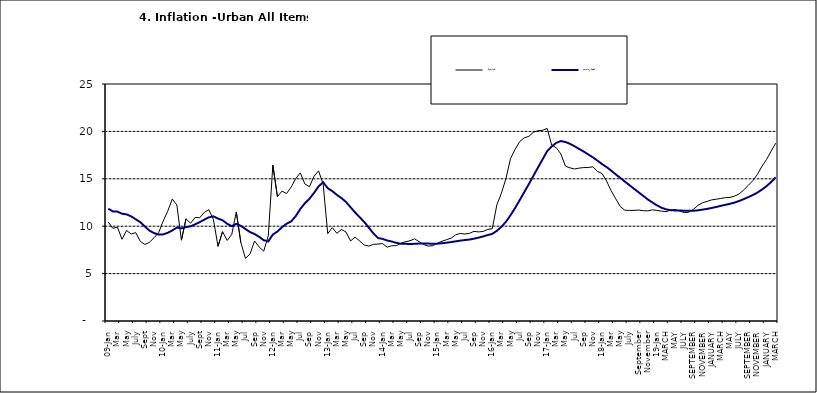
| Category | Year-on Rate | 12-Month Average |
|---|---|---|
| 09-Jan | 10.439 | 11.844 |
| Feb | 9.772 | 11.562 |
| Mar | 9.907 | 11.538 |
| Apr | 8.618 | 11.319 |
| May | 9.547 | 11.246 |
| June | 9.17 | 11.039 |
| July | 9.325 | 10.738 |
| Aug | 8.401 | 10.424 |
| Sept | 8.07 | 9.973 |
| Oct | 8.3 | 9.535 |
| Nov | 8.781 | 9.278 |
| Dec | 9.298 | 9.117 |
| 10-Jan | 10.534 | 9.136 |
| Feb | 11.584 | 9.297 |
| Mar | 12.864 | 9.555 |
| Apr | 12.24 | 9.859 |
| May | 8.524 | 9.769 |
| June | 10.781 | 9.904 |
| July | 10.313 | 9.987 |
| Aug | 10.924 | 10.197 |
| Sept | 10.891 | 10.43 |
| Oct | 11.457 | 10.689 |
| Nov | 11.748 | 10.932 |
| Dec | 10.699 | 11.042 |
| 11-Jan | 7.878 | 10.806 |
| Feb | 9.426 | 10.623 |
| Mar | 8.498 | 10.26 |
| Apr | 9.11 | 10.005 |
| May | 11.5 | 10.249 |
| Jun | 8.278 | 10.034 |
| Jul | 6.608 | 9.711 |
| Aug | 7.061 | 9.38 |
| Sep | 8.443 | 9.178 |
| Oct | 7.802 | 8.88 |
| Nov | 7.365 | 8.525 |
| Dec | 8.993 | 8.395 |
| 12-Jan | 16.445 | 9.119 |
| Feb | 13.123 | 9.443 |
| Mar | 13.701 | 9.889 |
| Apr | 13.447 | 10.259 |
| May | 14.127 | 10.496 |
| Jun | 15.012 | 11.062 |
| Jul | 15.63 | 11.81 |
| Aug | 14.456 | 12.422 |
| Sep | 14.162 | 12.893 |
| Oct | 15.26 | 13.506 |
| Nov | 15.836 | 14.199 |
| Dec | 14.459 | 14.637 |
| 13-Jan | 9.22 | 14.006 |
| Feb | 9.85 | 13.703 |
| Mar | 9.253 | 13.302 |
| Apr | 9.657 | 12.966 |
| May | 9.385 | 12.557 |
| Jun | 8.441 | 11.999 |
| Jul | 8.849 | 11.443 |
| Aug | 8.431 | 10.946 |
| Sep | 8.013 | 10.44 |
| Oct | 7.9 | 9.849 |
| Nov | 8.086 | 9.245 |
| Dec | 8.117 | 8.75 |
| 14-Jan | 8.164 | 8.662 |
| Feb | 7.791 | 8.493 |
| Mar | 7.937 | 8.384 |
| Apr | 7.947 | 8.246 |
| May | 8.195 | 8.151 |
| Jun | 8.358 | 8.146 |
| Jul | 8.464 | 8.118 |
| Aug | 8.673 | 8.141 |
| Sep | 8.357 | 8.17 |
| Oct | 8.064 | 8.182 |
| Nov | 7.902 | 8.165 |
| Dec | 7.948 | 8.151 |
| 15-Jan | 8.211 | 8.155 |
| Feb | 8.412 | 8.206 |
| Mar | 8.579 | 8.26 |
| Apr | 8.742 | 8.326 |
| May | 9.092 | 8.403 |
| Jun | 9.232 | 8.478 |
| Jul | 9.177 | 8.54 |
| Aug | 9.25 | 8.591 |
| Sep | 9.455 | 8.684 |
| Oct | 9.398 | 8.795 |
| Nov | 9.442 | 8.922 |
| Dec | 9.665 | 9.064 |
| 16-Jan | 9.728 | 9.19 |
| Feb | 12.254 | 9.516 |
| Mar | 13.485 | 9.935 |
| Apr | 15.052 | 10.474 |
| May | 17.148 | 11.165 |
| Jun | 18.111 | 11.925 |
| Jul | 18.927 | 12.754 |
| Aug | 19.325 | 13.605 |
| Sep | 19.476 | 14.444 |
| Oct | 19.914 | 15.318 |
| Nov | 20.067 | 16.193 |
| Dec | 20.118 | 17.05 |
| 17-Jan | 20.315 | 17.914 |
| Feb | 18.569 | 18.418 |
| Mar | 18.27 | 18.794 |
| Apr | 17.621 | 18.982 |
| May | 16.343 | 18.883 |
| Jun | 16.153 | 18.692 |
| Jul | 16.038 | 18.43 |
| Aug | 16.128 | 18.151 |
| Sep | 16.183 | 17.872 |
| Oct | 16.187 | 17.567 |
| Nov | 16.267 | 17.264 |
| Dec | 15.785 | 16.921 |
| 18-Jan | 15.559 | 16.55 |
| Feb | 14.763 | 16.241 |
| Mar | 13.748 | 15.866 |
| Apr | 12.893 | 15.468 |
| May | 12.077 | 15.096 |
| June | 11.683 | 14.706 |
| July | 11.661 | 14.329 |
| August | 11.673 | 13.951 |
| September | 11.697 | 13.578 |
| October | 11.64 | 13.206 |
| November | 11.615 | 12.831 |
| December | 11.731 | 12.509 |
| 19-Jan | 11.664 | 12.203 |
| February | 11.592 | 11.954 |
| MARCH | 11.535 | 11.78 |
| APRIL | 11.696 | 11.686 |
| MAY | 11.756 | 11.662 |
| JUNE | 11.605 | 11.655 |
| JULY | 11.432 | 11.635 |
| AUGUST | 11.479 | 11.618 |
| SEPTEMBER | 11.776 | 11.626 |
| OCTOBER | 12.202 | 11.676 |
| NOVEMBER | 12.469 | 11.75 |
| DECEMBER | 12.617 | 11.827 |
| JANUARY | 12.779 | 11.923 |
| FEBRUARY | 12.847 | 12.03 |
| MARCH | 12.932 | 12.147 |
| APRIL | 13.008 | 12.258 |
| MAY | 13.033 | 12.365 |
| JUNE | 13.178 | 12.496 |
| JULY | 13.403 | 12.659 |
| AUGUST | 13.827 | 12.855 |
| SEPTEMBER | 14.306 | 13.068 |
| OCTOBER | 14.811 | 13.289 |
| NOVEMBER | 15.466 | 13.546 |
| DECEMBER | 16.327 | 13.864 |
| JANUARY | 17.03 | 14.228 |
| FEBRUARY | 17.918 | 14.66 |
| MARCH | 18.756 | 15.154 |